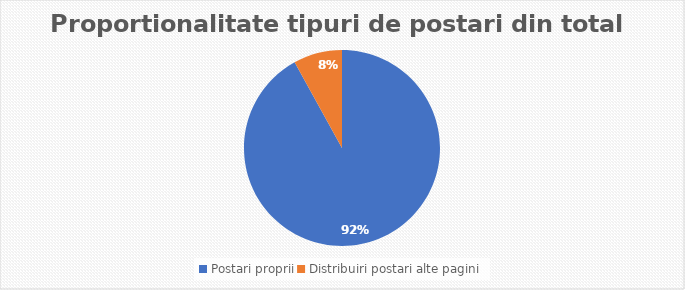
| Category | Series 0 |
|---|---|
| Postari proprii | 126 |
| Distribuiri postari alte pagini | 11 |